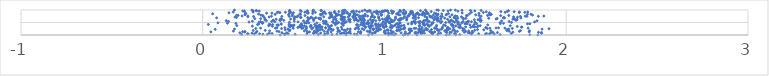
| Category | Series 0 |
|---|---|
| 1.8438936157573176 | 0.001 |
| 0.4256674932527743 | 0.002 |
| 0.911953011612636 | 0.003 |
| 1.1040859991475749 | 0.004 |
| 1.1787257875493318 | 0.005 |
| 1.3923923679515942 | 0.006 |
| 1.0236948340593237 | 0.007 |
| 1.0532423448962431 | 0.008 |
| 1.3403212470205785 | 0.009 |
| 1.7996658252891677 | 0.01 |
| 0.7888351358079853 | 0.011 |
| 1.4144852540602133 | 0.012 |
| 0.6363939020115403 | 0.013 |
| 1.636160623481195 | 0.014 |
| 0.7115385103624983 | 0.015 |
| 1.29357375120017 | 0.016 |
| 0.6688153314050215 | 0.017 |
| 1.1279973445585871 | 0.018 |
| 1.3572918561338354 | 0.019 |
| 0.2139469885280445 | 0.02 |
| 1.1125068891171774 | 0.021 |
| 0.45189188616307663 | 0.022 |
| 1.0411081092925865 | 0.023 |
| 0.35573032619404055 | 0.024 |
| 0.8483142597957474 | 0.025 |
| 0.4536478594561735 | 0.026 |
| 0.5083574089334616 | 0.027 |
| 0.9321189286647785 | 0.028 |
| 0.44825997662852113 | 0.029 |
| 0.33089283143013015 | 0.03 |
| 1.0221776447313897 | 0.031 |
| 0.738070737628259 | 0.032 |
| 0.8350222285193072 | 0.033 |
| 0.6751564485707275 | 0.034 |
| 1.0616765938343762 | 0.035 |
| 1.604240177692315 | 0.036 |
| 1.3906142667906276 | 0.037 |
| 0.28324913932921847 | 0.038 |
| 1.2647623054434503 | 0.039 |
| 1.4785122549884546 | 0.04 |
| 1.5554090086629766 | 0.041 |
| 0.5732361862831811 | 0.042 |
| 1.1306129370312052 | 0.043 |
| 0.31240657247157844 | 0.044 |
| 0.4700724940160792 | 0.045 |
| 0.2490015343782206 | 0.046 |
| 1.5774566233568632 | 0.047 |
| 0.2464613705899228 | 0.048 |
| 1.5183182032205556 | 0.049 |
| 0.7573103530183313 | 0.05 |
| 1.1740553027290597 | 0.051 |
| 1.0313953276368422 | 0.052 |
| 1.0038176810134625 | 0.053 |
| 1.3841838351472768 | 0.054 |
| 1.296186496250182 | 0.055 |
| 1.2031463897731118 | 0.056 |
| 1.5621499680339026 | 0.057 |
| 0.3815948136512741 | 0.058 |
| 1.2598501945424658 | 0.059 |
| 1.697794890092295 | 0.06 |
| 0.8681366318265862 | 0.061 |
| 1.1165637669570967 | 0.062 |
| 0.6887016957797044 | 0.063 |
| 0.8127502190042836 | 0.064 |
| 1.0064588001927202 | 0.065 |
| 1.8639860948172151 | 0.066 |
| 1.2017933893559563 | 0.067 |
| 0.6108010574634385 | 0.068 |
| 0.766365274682388 | 0.069 |
| 0.9322309571076606 | 0.07 |
| 0.27053662646684606 | 0.071 |
| 0.7783524823849933 | 0.072 |
| 0.3664113870873231 | 0.073 |
| 1.2190310097819246 | 0.074 |
| 0.6096536719953802 | 0.075 |
| 1.205623275003235 | 0.076 |
| 1.2680627604756187 | 0.077 |
| 0.6485643922632165 | 0.078 |
| 1.3082651667316392 | 0.079 |
| 0.7920874272491486 | 0.08 |
| 1.0213435737338106 | 0.081 |
| 1.137938705498944 | 0.082 |
| 1.4681152156693509 | 0.083 |
| 1.167420271348707 | 0.084 |
| 1.0917251841846387 | 0.085 |
| 0.6137917534155762 | 0.086 |
| 0.949013735587834 | 0.087 |
| 0.46230406916504485 | 0.088 |
| 0.2041263350813739 | 0.089 |
| 0.7767610643308159 | 0.09 |
| 0.4358997055101054 | 0.091 |
| 1.5866170127746424 | 0.092 |
| 0.626035499819206 | 0.093 |
| 0.2926001172153504 | 0.094 |
| 1.4606468969985116 | 0.095 |
| 0.8689856413042562 | 0.096 |
| 1.174586720276704 | 0.097 |
| 1.621161861812211 | 0.098 |
| 1.1862443692257325 | 0.099 |
| 0.9449172250851346 | 0.1 |
| 1.3432230148856177 | 0.101 |
| 1.4858645810767457 | 0.102 |
| 0.803174993489331 | 0.103 |
| 1.86396315312351 | 0.104 |
| 1.1702030182914118 | 0.105 |
| 0.5766221478911072 | 0.106 |
| 1.5958582403281822 | 0.107 |
| 0.9185454972814922 | 0.108 |
| 1.846934764109804 | 0.109 |
| 1.3666032417364167 | 0.11 |
| 1.3606986207919682 | 0.111 |
| 1.4384921198862122 | 0.112 |
| 0.9475419694817183 | 0.113 |
| 1.2606993618648796 | 0.114 |
| 1.7061959794485366 | 0.115 |
| 0.9999316862356284 | 0.116 |
| 1.0490585760011868 | 0.117 |
| 1.0413125208933605 | 0.118 |
| 0.9984310859251226 | 0.119 |
| 1.198830128292915 | 0.12 |
| 1.1147519435306399 | 0.121 |
| 0.5873773427167098 | 0.122 |
| 0.23114906065461926 | 0.123 |
| 0.7055489421990553 | 0.124 |
| 0.8555580228724442 | 0.125 |
| 0.04446541524293324 | 0.126 |
| 1.7959498262071008 | 0.127 |
| 1.2078365941563964 | 0.128 |
| 1.2762394466630962 | 0.129 |
| 1.3906718540608296 | 0.13 |
| 0.2199163243882395 | 0.131 |
| 1.3381948067389957 | 0.132 |
| 0.6260531580755702 | 0.133 |
| 0.6849581147362018 | 0.134 |
| 0.41958606481139227 | 0.135 |
| 0.7434080853026366 | 0.136 |
| 0.23236903861065794 | 0.137 |
| 0.5753065194649413 | 0.138 |
| 1.251527363012631 | 0.139 |
| 0.8688567273334334 | 0.14 |
| 1.2491011761564705 | 0.141 |
| 0.2980801695267826 | 0.142 |
| 1.4824560835016014 | 0.143 |
| 0.6686044356517533 | 0.144 |
| 1.4468314293246607 | 0.145 |
| 1.4008297778378793 | 0.146 |
| 1.686213585113197 | 0.147 |
| 1.742007598806821 | 0.148 |
| 0.9050955737164522 | 0.149 |
| 0.810062563686438 | 0.15 |
| 0.7535882673260551 | 0.151 |
| 0.9168711413222719 | 0.152 |
| 1.1438211172428479 | 0.153 |
| 0.4083881945237138 | 0.154 |
| 0.16867576204871204 | 0.155 |
| 1.3394270143721796 | 0.156 |
| 0.6128391551034864 | 0.157 |
| 0.9214809420894206 | 0.158 |
| 1.1988880073948693 | 0.159 |
| 1.2142920352356588 | 0.16 |
| 1.4633511323475712 | 0.161 |
| 0.5586265429564043 | 0.162 |
| 0.9640770474882591 | 0.163 |
| 1.2971214881891546 | 0.164 |
| 1.0003769658469883 | 0.165 |
| 1.3310351901597879 | 0.166 |
| 0.3679111633943546 | 0.167 |
| 1.7975911982406163 | 0.168 |
| 1.1894469384094435 | 0.169 |
| 0.4774102173595627 | 0.17 |
| 1.1497489113401196 | 0.171 |
| 1.58443741240445 | 0.172 |
| 1.0824871334337907 | 0.173 |
| 1.7480795918490268 | 0.174 |
| 1.0675637739036663 | 0.175 |
| 0.6366573991886569 | 0.176 |
| 0.7872829323034213 | 0.177 |
| 0.2777289419146801 | 0.178 |
| 0.9565169456331258 | 0.179 |
| 1.0354591056628029 | 0.18 |
| 1.0699708854958656 | 0.181 |
| 1.6726999928867983 | 0.182 |
| 1.1390536636427955 | 0.183 |
| 1.4309757058203378 | 0.184 |
| 1.3760545886513549 | 0.185 |
| 0.3435223781688995 | 0.186 |
| 1.4963029737765048 | 0.187 |
| 1.0210384486488702 | 0.188 |
| 1.2199460481268045 | 0.189 |
| 1.1954230969568476 | 0.19 |
| 0.7786837028672214 | 0.191 |
| 1.012693050066475 | 0.192 |
| 0.6269859385657236 | 0.193 |
| 1.1993726333748413 | 0.194 |
| 0.7156533797932242 | 0.195 |
| 1.3013646504780763 | 0.196 |
| 1.1368466997717082 | 0.197 |
| 1.384176838879851 | 0.198 |
| 1.2340705613332132 | 0.199 |
| 1.6764478581195843 | 0.2 |
| 0.473016187909301 | 0.201 |
| 1.340830279107675 | 0.202 |
| 0.6918665948354881 | 0.203 |
| 0.7444184264327961 | 0.204 |
| 0.4803873357748114 | 0.205 |
| 0.4537591054304101 | 0.206 |
| 1.0171230380178953 | 0.207 |
| 1.5463287229676528 | 0.208 |
| 0.9688311140743342 | 0.209 |
| 0.8866927107089437 | 0.21 |
| 1.0768982646492637 | 0.211 |
| 0.71765244271831 | 0.212 |
| 1.3495526957132316 | 0.213 |
| 1.6735375776905816 | 0.214 |
| 1.5116018112976608 | 0.215 |
| 0.6578331415708868 | 0.216 |
| 0.6454871557968953 | 0.217 |
| 1.2583416921545605 | 0.218 |
| 1.1885470048342885 | 0.219 |
| 0.56782250220449 | 0.22 |
| 1.2922378036710007 | 0.221 |
| 1.2893345451089062 | 0.222 |
| 1.4383257093641162 | 0.223 |
| 0.979017534935888 | 0.224 |
| 0.9395419766570786 | 0.225 |
| 0.0684831346432786 | 0.226 |
| 0.9361607522863752 | 0.227 |
| 1.2368943595608126 | 0.228 |
| 1.3472487779833537 | 0.229 |
| 0.7059717086507681 | 0.23 |
| 1.0912357500363221 | 0.231 |
| 0.7663424533239908 | 0.232 |
| 1.3135256961723583 | 0.233 |
| 0.7963456902006653 | 0.234 |
| 0.8583548327120225 | 0.235 |
| 1.1349566399689344 | 0.236 |
| 1.8669331356030068 | 0.237 |
| 0.17429633613368634 | 0.238 |
| 1.6838224460191005 | 0.239 |
| 0.811323411179664 | 0.24 |
| 1.1399589950964528 | 0.241 |
| 1.146041111238866 | 0.242 |
| 0.4690266772962166 | 0.243 |
| 0.8384390672112365 | 0.244 |
| 0.5996202500641734 | 0.245 |
| 0.9407755280729507 | 0.246 |
| 0.6258047523575079 | 0.247 |
| 1.3596719679127136 | 0.248 |
| 1.1043247694679574 | 0.249 |
| 1.9048461928251634 | 0.25 |
| 0.9685296508885334 | 0.251 |
| 0.8770974512343509 | 0.252 |
| 1.2861463873901375 | 0.253 |
| 1.2061736281769058 | 0.254 |
| 1.1102313258538223 | 0.255 |
| 0.6969814517254913 | 0.256 |
| 0.43371912584277295 | 0.257 |
| 1.4308672159538773 | 0.258 |
| 1.1916231555511863 | 0.259 |
| 0.2914387325089558 | 0.26 |
| 1.5654523708151835 | 0.261 |
| 0.5456240551566739 | 0.262 |
| 1.1633410288745933 | 0.263 |
| 0.9214296381272381 | 0.264 |
| 1.7033860683006323 | 0.265 |
| 1.1726906093965477 | 0.266 |
| 0.7007787493045445 | 0.267 |
| 0.9550931696778792 | 0.268 |
| 0.49773672943908664 | 0.269 |
| 1.106402682364232 | 0.27 |
| 1.2272308673287715 | 0.271 |
| 1.5800679287876114 | 0.272 |
| 1.3175170505399265 | 0.273 |
| 1.2753645580707036 | 0.274 |
| 0.39973852403444565 | 0.275 |
| 1.7900784214832561 | 0.276 |
| 0.31831584397889734 | 0.277 |
| 1.6622457363645249 | 0.278 |
| 0.5711531360283408 | 0.279 |
| 1.346093661981631 | 0.28 |
| 1.6136140616384886 | 0.281 |
| 0.8441950233263052 | 0.282 |
| 0.6335092298702253 | 0.283 |
| 0.676740342502381 | 0.284 |
| 0.7416022872837628 | 0.285 |
| 0.5521346855937569 | 0.286 |
| 1.6275103550943442 | 0.287 |
| 0.6061945979702953 | 0.288 |
| 0.40806687666326547 | 0.289 |
| 0.6762849537355075 | 0.29 |
| 0.45198437439536654 | 0.291 |
| 1.3789506052535392 | 0.292 |
| 0.9196757900090289 | 0.293 |
| 0.8532945347432529 | 0.294 |
| 1.0403938866761215 | 0.295 |
| 0.5233743861832347 | 0.296 |
| 0.8946353962434099 | 0.297 |
| 1.414887031582405 | 0.298 |
| 0.9972509710719478 | 0.299 |
| 1.1108976263576682 | 0.3 |
| 1.5571187584965365 | 0.301 |
| 1.2067119481047452 | 0.302 |
| 0.6510258459432072 | 0.303 |
| 1.0689228576145307 | 0.304 |
| 1.0310353685493618 | 0.305 |
| 1.3480955344541659 | 0.306 |
| 1.0780209370744402 | 0.307 |
| 1.4747953566621654 | 0.308 |
| 0.6279453503439968 | 0.309 |
| 1.0844548925929445 | 0.31 |
| 0.9211051461851083 | 0.311 |
| 1.4178519609339215 | 0.312 |
| 0.7627705987624745 | 0.313 |
| 1.3193834534071125 | 0.314 |
| 1.755569736779277 | 0.315 |
| 1.7542456342419346 | 0.316 |
| 1.0427895325623453 | 0.317 |
| 1.4972166695415146 | 0.318 |
| 0.6497015862557737 | 0.319 |
| 0.9228735784415127 | 0.32 |
| 0.99258782856671 | 0.321 |
| 1.4080803456413358 | 0.322 |
| 1.4464373386984017 | 0.323 |
| 1.51060589402181 | 0.324 |
| 0.592696589035448 | 0.325 |
| 0.6563762479533972 | 0.326 |
| 0.9653658490210708 | 0.327 |
| 0.6387214192121617 | 0.328 |
| 0.5367614109296436 | 0.329 |
| 0.8949676084322169 | 0.33 |
| 0.6429146907626828 | 0.331 |
| 0.5694042668955496 | 0.332 |
| 0.9947804220424995 | 0.333 |
| 1.284534867766998 | 0.334 |
| 0.5305905790000994 | 0.335 |
| 0.4807856804607441 | 0.336 |
| 0.5397831365128031 | 0.337 |
| 1.0099532456371003 | 0.338 |
| 0.4963173713765606 | 0.339 |
| 0.4826918514183951 | 0.34 |
| 1.7303954261482464 | 0.341 |
| 1.4894105527317127 | 0.342 |
| 0.6202459409831026 | 0.343 |
| 1.4141763235138662 | 0.344 |
| 0.692439479075697 | 0.345 |
| 1.2458384634778905 | 0.346 |
| 1.485390666221123 | 0.347 |
| 0.7024927215593103 | 0.348 |
| 0.3829178033886468 | 0.349 |
| 0.9693686981952638 | 0.35 |
| 0.9133082867001172 | 0.351 |
| 0.8568125726330379 | 0.352 |
| 0.9282973384346955 | 0.353 |
| 1.2451689368067393 | 0.354 |
| 0.9766848414430689 | 0.355 |
| 0.27278445478048896 | 0.356 |
| 1.1933371423626733 | 0.357 |
| 0.4742577537285261 | 0.358 |
| 1.0446064385226979 | 0.359 |
| 1.006703763052917 | 0.36 |
| 1.3918126181027393 | 0.361 |
| 1.5154203945522156 | 0.362 |
| 1.084332869430337 | 0.363 |
| 0.5599199456021613 | 0.364 |
| 0.9337876963009762 | 0.365 |
| 0.9532955844355497 | 0.366 |
| 0.595690424274507 | 0.367 |
| 0.6284826759914433 | 0.368 |
| 1.691779974470899 | 0.369 |
| 0.3633377998808264 | 0.37 |
| 1.5267485992183096 | 0.371 |
| 1.094472461744382 | 0.372 |
| 0.6390281847329726 | 0.373 |
| 1.1914992744996695 | 0.374 |
| 0.1876554972291643 | 0.375 |
| 1.335136817684917 | 0.376 |
| 1.3787461693803968 | 0.377 |
| 0.9755715429380284 | 0.378 |
| 1.3709822508734246 | 0.379 |
| 0.7088596358560478 | 0.38 |
| 0.4908012987995115 | 0.381 |
| 0.5471572268996069 | 0.382 |
| 1.056305502075931 | 0.383 |
| 0.5942835103659467 | 0.384 |
| 0.8826764797309171 | 0.385 |
| 1.286601565665745 | 0.386 |
| 1.1067438660769224 | 0.387 |
| 0.8857658910388927 | 0.388 |
| 0.4116459104266237 | 0.389 |
| 0.7732318165184505 | 0.39 |
| 1.0360799709092667 | 0.391 |
| 1.219937907944692 | 0.392 |
| 1.2399809901136 | 0.393 |
| 0.9272335874635881 | 0.394 |
| 1.219990259441886 | 0.395 |
| 0.4161648831225093 | 0.396 |
| 0.9905177022239078 | 0.397 |
| 0.4816728351031089 | 0.398 |
| 0.6436402627105048 | 0.399 |
| 1.3254568558291657 | 0.4 |
| 1.2404078026193566 | 0.401 |
| 0.5024264227105206 | 0.402 |
| 0.4086224566138592 | 0.403 |
| 1.2572234492913095 | 0.404 |
| 1.5679645798209387 | 0.405 |
| 0.5380294992720611 | 0.406 |
| 1.4696726760759566 | 0.407 |
| 0.9674041721105692 | 0.408 |
| 0.8460668083395503 | 0.409 |
| 1.058923254950448 | 0.41 |
| 1.4154123767131959 | 0.411 |
| 0.7303718196380851 | 0.412 |
| 0.8692411275542975 | 0.413 |
| 0.8507037324674787 | 0.414 |
| 1.0733985350799538 | 0.415 |
| 0.37036631202058123 | 0.416 |
| 0.30165300650673943 | 0.417 |
| 0.38468188575314977 | 0.418 |
| 1.373377939426157 | 0.419 |
| 0.6865978645537002 | 0.42 |
| 1.4940173490751532 | 0.421 |
| 0.030630997735233367 | 0.422 |
| 0.6161300079347796 | 0.423 |
| 0.9529343405754602 | 0.424 |
| 0.36479641183523104 | 0.425 |
| 1.2122121926440697 | 0.426 |
| 0.9663278964886624 | 0.427 |
| 1.3677315582506364 | 0.428 |
| 0.4754337988384221 | 0.429 |
| 0.9524764433382376 | 0.43 |
| 1.404381543911247 | 0.431 |
| 0.9490668143765804 | 0.432 |
| 0.8887564488594536 | 0.433 |
| 1.0739781107100028 | 0.434 |
| 0.3079009260925093 | 0.435 |
| 0.43222843741330585 | 0.436 |
| 1.0740693453434031 | 0.437 |
| 1.0052707396175666 | 0.438 |
| 0.6766752931290062 | 0.439 |
| 0.984088285609268 | 0.44 |
| 1.2321965550488012 | 0.441 |
| 1.1490956345956975 | 0.442 |
| 0.4309578994803266 | 0.443 |
| 0.5434188196395576 | 0.444 |
| 1.1300947452224155 | 0.445 |
| 1.7867092732991958 | 0.446 |
| 0.9099214145374263 | 0.447 |
| 1.8000758410360194 | 0.448 |
| 1.4426764258392784 | 0.449 |
| 1.4535916710064043 | 0.45 |
| 1.5070511358586556 | 0.451 |
| 0.7680945838545143 | 0.452 |
| 0.9028649993578197 | 0.453 |
| 1.6375457026486588 | 0.454 |
| 0.8776894806368502 | 0.455 |
| 1.1938798191397955 | 0.456 |
| 1.214709248181903 | 0.457 |
| 0.7643982128198207 | 0.458 |
| 1.0698158688969923 | 0.459 |
| 1.403779886067504 | 0.46 |
| 1.004756539346329 | 0.461 |
| 1.1697534586815495 | 0.462 |
| 0.18240950197802164 | 0.463 |
| 0.3279251229961636 | 0.464 |
| 1.2645941923952764 | 0.465 |
| 0.912311755015514 | 0.466 |
| 1.6549802535460112 | 0.467 |
| 0.9137656209849143 | 0.468 |
| 0.7408129208952987 | 0.469 |
| 0.6656197535756342 | 0.47 |
| 0.9295650911999728 | 0.471 |
| 1.4537949065643083 | 0.472 |
| 0.7300082134272031 | 0.473 |
| 0.13567185351429412 | 0.474 |
| 1.0845327345981686 | 0.475 |
| 0.5718628160284915 | 0.476 |
| 0.9017894775193485 | 0.477 |
| 0.6737657432018033 | 0.478 |
| 1.0291941503644693 | 0.479 |
| 0.7802006914012373 | 0.48 |
| 1.2603693029405343 | 0.481 |
| 0.6281399511065148 | 0.482 |
| 0.5616770751337722 | 0.483 |
| 1.4252839413278098 | 0.484 |
| 0.7301692634236113 | 0.485 |
| 0.08384696369285338 | 0.486 |
| 1.086152912161459 | 0.487 |
| 0.5618095053195215 | 0.488 |
| 1.3096266950865139 | 0.489 |
| 0.5836748085130523 | 0.49 |
| 1.2153157047725176 | 0.491 |
| 1.6357902615763766 | 0.492 |
| 1.2127354369915149 | 0.493 |
| 0.719572220828003 | 0.494 |
| 0.3308131985539514 | 0.495 |
| 1.2672278819270026 | 0.496 |
| 1.337092382469578 | 0.497 |
| 0.883979923635105 | 0.498 |
| 1.4036050548286703 | 0.499 |
| 1.4492263152158285 | 0.5 |
| 0.3261719493100448 | 0.501 |
| 0.7477919741585917 | 0.502 |
| 1.6986419025503334 | 0.503 |
| 1.0230813925797673 | 0.504 |
| 0.9320422602698906 | 0.505 |
| 1.0317662016666667 | 0.506 |
| 1.3561181129245714 | 0.507 |
| 0.47700070255674853 | 0.508 |
| 0.8739250637583597 | 0.509 |
| 1.3861587556473731 | 0.51 |
| 1.1529320245622072 | 0.511 |
| 0.31016827066149455 | 0.512 |
| 0.9945305058837395 | 0.513 |
| 1.4974246024329 | 0.514 |
| 1.4063459059776906 | 0.515 |
| 1.1503654990832077 | 0.516 |
| 1.20958689415392 | 0.517 |
| 0.7817489606305439 | 0.518 |
| 0.25437482458439586 | 0.519 |
| 1.1869119103373043 | 0.52 |
| 0.9932381865614953 | 0.521 |
| 1.8255930055580025 | 0.522 |
| 1.1701209747543175 | 0.523 |
| 0.8106217365451776 | 0.524 |
| 0.5242666371510013 | 0.525 |
| 1.034056893046847 | 0.526 |
| 1.1602872824762738 | 0.527 |
| 0.7902188031913154 | 0.528 |
| 0.39704067265488097 | 0.529 |
| 0.7145738503469362 | 0.53 |
| 1.4782402639706556 | 0.531 |
| 0.31787712456774175 | 0.532 |
| 0.9334431463207219 | 0.533 |
| 0.6796247290326058 | 0.534 |
| 1.458802434778653 | 0.535 |
| 1.3151082745072389 | 0.536 |
| 1.045408668394224 | 0.537 |
| 1.2466085372076292 | 0.538 |
| 1.23943640939323 | 0.539 |
| 1.4323512340941151 | 0.54 |
| 0.37903694888537465 | 0.541 |
| 1.6857601690350603 | 0.542 |
| 1.1958762693502982 | 0.543 |
| 0.14190610062354214 | 0.544 |
| 1.52833787418483 | 0.545 |
| 1.3771217842732895 | 0.546 |
| 1.1643271305895928 | 0.547 |
| 1.012541019548753 | 0.548 |
| 1.462212559494446 | 0.549 |
| 0.7723771732765635 | 0.55 |
| 0.2733356666704013 | 0.551 |
| 1.355149653727755 | 0.552 |
| 0.573617655563261 | 0.553 |
| 0.674806968605774 | 0.554 |
| 0.50356516991707 | 0.555 |
| 1.3022403394782556 | 0.556 |
| 0.9294375125683715 | 0.557 |
| 0.6629007270800279 | 0.558 |
| 0.8874895087692432 | 0.559 |
| 0.9097128601231597 | 0.56 |
| 1.0104145352511502 | 0.561 |
| 0.8566620978012256 | 0.562 |
| 1.0364584769448109 | 0.563 |
| 1.6443854147208792 | 0.564 |
| 1.3617137350698538 | 0.565 |
| 1.291537022896084 | 0.566 |
| 0.5540946803771726 | 0.567 |
| 1.8390282185952973 | 0.568 |
| 0.952458856506331 | 0.569 |
| 0.7360381208463138 | 0.57 |
| 0.12891722346256906 | 0.571 |
| 1.0393701871696432 | 0.572 |
| 0.35037357112968615 | 0.573 |
| 0.6102954917407858 | 0.574 |
| 1.014520016379298 | 0.575 |
| 0.8891610915476866 | 0.576 |
| 1.3965660265629416 | 0.577 |
| 1.0810887505477886 | 0.578 |
| 1.217234117728836 | 0.579 |
| 0.8045943239903832 | 0.58 |
| 0.9342043893169097 | 0.581 |
| 0.4270958838274913 | 0.582 |
| 1.2270676240464997 | 0.583 |
| 0.44575128424595345 | 0.584 |
| 1.5325918326078707 | 0.585 |
| 0.3882996730398053 | 0.586 |
| 0.38814302099921394 | 0.587 |
| 1.0545108897961004 | 0.588 |
| 0.8485465537365118 | 0.589 |
| 1.7257397530316814 | 0.59 |
| 0.8721276631290449 | 0.591 |
| 0.8338086337401313 | 0.592 |
| 0.9734175692823284 | 0.593 |
| 0.9396715561426078 | 0.594 |
| 1.122035719960508 | 0.595 |
| 0.423932534053734 | 0.596 |
| 1.368152357054797 | 0.597 |
| 0.765266296104421 | 0.598 |
| 0.579379571239767 | 0.599 |
| 1.0350217046844072 | 0.6 |
| 1.7206270571288846 | 0.601 |
| 0.3420424961370515 | 0.602 |
| 1.2723043319492846 | 0.603 |
| 1.0376003304292356 | 0.604 |
| 1.5218293720938758 | 0.605 |
| 1.0757193383760213 | 0.606 |
| 0.8833104246373717 | 0.607 |
| 1.5145168283584185 | 0.608 |
| 1.4944542336184585 | 0.609 |
| 0.7801751184077425 | 0.61 |
| 0.805044541830554 | 0.611 |
| 1.085592917874256 | 0.612 |
| 1.010122006384723 | 0.613 |
| 1.0166562982651723 | 0.614 |
| 0.8088524071638188 | 0.615 |
| 0.8108972035579952 | 0.616 |
| 0.7199242120781242 | 0.617 |
| 0.8885993981229255 | 0.618 |
| 1.729776323051849 | 0.619 |
| 0.8433974468917153 | 0.62 |
| 0.9214805801261184 | 0.621 |
| 1.2869233878826933 | 0.622 |
| 1.2323289269780937 | 0.623 |
| 1.0027337199937834 | 0.624 |
| 1.08976811025324 | 0.625 |
| 0.647412272078871 | 0.626 |
| 0.8032149605483411 | 0.627 |
| 0.34409507640352455 | 0.628 |
| 1.3470168279555004 | 0.629 |
| 1.2348914721534423 | 0.63 |
| 1.7065290365907775 | 0.631 |
| 0.4040511197470811 | 0.632 |
| 1.1231280119484353 | 0.633 |
| 1.171004255111705 | 0.634 |
| 0.503895825333473 | 0.635 |
| 0.9890538512590838 | 0.636 |
| 0.48352713096707234 | 0.637 |
| 1.0933597148168095 | 0.638 |
| 0.42796538165867726 | 0.639 |
| 1.6138814356436808 | 0.64 |
| 1.2778305363939322 | 0.641 |
| 0.7599834610977767 | 0.642 |
| 1.310491391607843 | 0.643 |
| 0.8401326317702884 | 0.644 |
| 0.583223535284656 | 0.645 |
| 1.084678170114977 | 0.646 |
| 0.43391636043241466 | 0.647 |
| 0.8653620389210065 | 0.648 |
| 0.8679070755290684 | 0.649 |
| 0.6134514587419126 | 0.65 |
| 0.7319307217931527 | 0.651 |
| 1.294841813572615 | 0.652 |
| 0.31859711067226437 | 0.653 |
| 1.4357644568224233 | 0.654 |
| 0.2862784970561304 | 0.655 |
| 1.3923374210073471 | 0.656 |
| 1.012839571496239 | 0.657 |
| 0.6055597875502304 | 0.658 |
| 0.7674942859250186 | 0.659 |
| 1.620082590107025 | 0.66 |
| 0.6476147954443914 | 0.661 |
| 1.091312909562403 | 0.662 |
| 1.0605795850485809 | 0.663 |
| 1.5259766637193273 | 0.664 |
| 1.7138729162032833 | 0.665 |
| 1.4309535455957254 | 0.666 |
| 1.4479210727559997 | 0.667 |
| 1.5735666828847523 | 0.668 |
| 1.4030142500269835 | 0.669 |
| 0.6377250409177453 | 0.67 |
| 0.9692413273417355 | 0.671 |
| 0.8840497665320635 | 0.672 |
| 1.1576993900901713 | 0.673 |
| 0.7708176576228691 | 0.674 |
| 1.3308942375965893 | 0.675 |
| 1.104239767076137 | 0.676 |
| 0.6450738607989945 | 0.677 |
| 1.0273987338159554 | 0.678 |
| 1.7506057022706436 | 0.679 |
| 1.1214128249097106 | 0.68 |
| 1.6603571955652148 | 0.681 |
| 0.8435913302900683 | 0.682 |
| 1.6537617928682804 | 0.683 |
| 0.5914165722750304 | 0.684 |
| 1.022152997546244 | 0.685 |
| 0.07635779611361393 | 0.686 |
| 0.5049618048320856 | 0.687 |
| 0.6958226411897313 | 0.688 |
| 0.9675826752959382 | 0.689 |
| 1.2644394815970341 | 0.69 |
| 1.3864548651641346 | 0.691 |
| 1.1870436031730276 | 0.692 |
| 0.7761171180727579 | 0.693 |
| 0.6223521942996864 | 0.694 |
| 0.8278352850124708 | 0.695 |
| 1.0122819285176714 | 0.696 |
| 0.5773617822315964 | 0.697 |
| 0.7246449454606053 | 0.698 |
| 0.5412053985486687 | 0.699 |
| 0.338380732970734 | 0.7 |
| 1.382571728885645 | 0.701 |
| 1.292076405780596 | 0.702 |
| 0.9442381277177144 | 0.703 |
| 0.18631973544596625 | 0.704 |
| 1.6564068671648204 | 0.705 |
| 0.7821826052077397 | 0.706 |
| 1.2332551697267409 | 0.707 |
| 0.8790900811915474 | 0.708 |
| 0.537019208346678 | 0.709 |
| 0.7033734999671646 | 0.71 |
| 1.7319705182130138 | 0.711 |
| 0.7753832307175517 | 0.712 |
| 0.17741053132910678 | 0.713 |
| 0.5973231531460659 | 0.714 |
| 0.9451523854113046 | 0.715 |
| 1.0606586704209215 | 0.716 |
| 0.7135022849333607 | 0.717 |
| 1.1707555090029023 | 0.718 |
| 1.2520604447384773 | 0.719 |
| 0.3649900257326779 | 0.72 |
| 1.1616173145089954 | 0.721 |
| 0.8619757427362109 | 0.722 |
| 1.279445802149748 | 0.723 |
| 0.9269896439911658 | 0.724 |
| 1.7097494900794257 | 0.725 |
| 0.8010481007333846 | 0.726 |
| 1.4232998634948686 | 0.727 |
| 0.5193614603138506 | 0.728 |
| 0.6656431175619529 | 0.729 |
| 1.3596453967730904 | 0.73 |
| 0.968108449696137 | 0.731 |
| 0.5058323050526368 | 0.732 |
| 1.2570055734740833 | 0.733 |
| 0.7667659814405605 | 0.734 |
| 0.930008664484604 | 0.735 |
| 0.24824101000201648 | 0.736 |
| 0.8258509945438234 | 0.737 |
| 1.3090229439593886 | 0.738 |
| 0.7618281130879293 | 0.739 |
| 1.1110505629343836 | 0.74 |
| 1.222190810011065 | 0.741 |
| 0.2794767557294727 | 0.742 |
| 1.3176658148421567 | 0.743 |
| 0.4349830269821867 | 0.744 |
| 1.7479509286184958 | 0.745 |
| 0.4761327599097177 | 0.746 |
| 1.8463903168295612 | 0.747 |
| 1.1304920650238854 | 0.748 |
| 1.783944337262784 | 0.749 |
| 0.8320076026754658 | 0.75 |
| 1.399478170662794 | 0.751 |
| 0.3779391623681151 | 0.752 |
| 1.7740742041814173 | 0.753 |
| 1.5315651781407646 | 0.754 |
| 1.0223435174111613 | 0.755 |
| 0.7320169364523846 | 0.756 |
| 0.24824858331661648 | 0.757 |
| 1.8767447802173916 | 0.758 |
| 0.8934090138412017 | 0.759 |
| 0.21658996232504413 | 0.76 |
| 0.9071308803142034 | 0.761 |
| 0.7059658403069892 | 0.762 |
| 0.8854220099092028 | 0.763 |
| 0.8636096316311165 | 0.764 |
| 0.8775384068270686 | 0.765 |
| 1.3889234940614172 | 0.766 |
| 1.1292106792405256 | 0.767 |
| 1.2484269675432937 | 0.768 |
| 0.4921836331045416 | 0.769 |
| 0.33104576811779474 | 0.77 |
| 0.8365539421188045 | 0.771 |
| 1.0187695441052245 | 0.772 |
| 0.5247431987268864 | 0.773 |
| 0.8068383586957038 | 0.774 |
| 1.4505962438877846 | 0.775 |
| 1.6393045865003573 | 0.776 |
| 0.5626928030761497 | 0.777 |
| 1.1689122838998312 | 0.778 |
| 0.32899573095311296 | 0.779 |
| 1.6839242087997024 | 0.78 |
| 1.5202603546640119 | 0.781 |
| 1.5670013986448226 | 0.782 |
| 1.4566369762095928 | 0.783 |
| 0.1945986268359401 | 0.784 |
| 0.7098691145931936 | 0.785 |
| 1.135351954309246 | 0.786 |
| 0.9339990336682104 | 0.787 |
| 0.9833958011023586 | 0.788 |
| 0.8377712664640659 | 0.789 |
| 0.18611070724214196 | 0.79 |
| 0.8382732779398047 | 0.791 |
| 0.7586989329832519 | 0.792 |
| 0.3199311892364345 | 0.793 |
| 0.7408353456556532 | 0.794 |
| 1.269150136381095 | 0.795 |
| 0.6513286334441812 | 0.796 |
| 1.2907881121194023 | 0.797 |
| 1.8144294597220778 | 0.798 |
| 1.1578865073319677 | 0.799 |
| 1.5806342617936515 | 0.8 |
| 1.0855451029221952 | 0.801 |
| 1.289132273023876 | 0.802 |
| 1.338730074694663 | 0.803 |
| 0.9813991998144433 | 0.804 |
| 1.208184009317798 | 0.805 |
| 0.8513263106279821 | 0.806 |
| 1.5018044600572504 | 0.807 |
| 1.3712557099142795 | 0.808 |
| 0.47204583656256516 | 0.809 |
| 1.2199968910851617 | 0.81 |
| 1.0790313907380966 | 0.811 |
| 0.7473279470837569 | 0.812 |
| 0.2327997992971491 | 0.813 |
| 0.8418564735169822 | 0.814 |
| 1.193703119649563 | 0.815 |
| 1.1877664091800724 | 0.816 |
| 0.7020601296344682 | 0.817 |
| 0.8077298916178215 | 0.818 |
| 0.5378009358183011 | 0.819 |
| 0.982528364216833 | 0.82 |
| 0.7377957541345025 | 0.821 |
| 1.3417472825454229 | 0.822 |
| 0.3984204078204847 | 0.823 |
| 0.646880976917903 | 0.824 |
| 0.7057069558471069 | 0.825 |
| 1.0756374298890483 | 0.826 |
| 0.4939344184872656 | 0.827 |
| 1.5879010409989436 | 0.828 |
| 0.8941205448264999 | 0.829 |
| 0.9817948022211487 | 0.83 |
| 1.2077635047269872 | 0.831 |
| 1.7865378623861163 | 0.832 |
| 1.8062271315259708 | 0.833 |
| 1.2949421000749393 | 0.834 |
| 1.1367400100001332 | 0.835 |
| 1.105817505222984 | 0.836 |
| 0.962245029269727 | 0.837 |
| 0.7683446688817084 | 0.838 |
| 0.8107079805150221 | 0.839 |
| 1.173735843187648 | 0.84 |
| 0.8316622252899082 | 0.841 |
| 0.6584546949977069 | 0.842 |
| 0.3072320128367828 | 0.843 |
| 1.3151337889226746 | 0.844 |
| 1.066486277618651 | 0.845 |
| 1.0734306383512067 | 0.846 |
| 0.05465352226304809 | 0.847 |
| 1.46794625535196 | 0.848 |
| 0.5350298528196041 | 0.849 |
| 1.5766574142281473 | 0.85 |
| 0.8330051343471184 | 0.851 |
| 0.7330852615730752 | 0.852 |
| 1.2210483611844625 | 0.853 |
| 0.23683232899090056 | 0.854 |
| 1.2832650664818033 | 0.855 |
| 0.6761931722227601 | 0.856 |
| 1.3518030470434228 | 0.857 |
| 1.229361598974501 | 0.858 |
| 1.1426909893676338 | 0.859 |
| 0.6046115805471423 | 0.86 |
| 1.2406345819122584 | 0.861 |
| 1.115399541187277 | 0.862 |
| 0.9304174457315603 | 0.863 |
| 1.236346363715351 | 0.864 |
| 0.835221518499742 | 0.865 |
| 1.5197716162374824 | 0.866 |
| 1.156402888156069 | 0.867 |
| 0.794881912613765 | 0.868 |
| 1.041765020617939 | 0.869 |
| 1.1817645693306775 | 0.87 |
| 0.47788236740907275 | 0.871 |
| 1.2746332959726892 | 0.872 |
| 0.3803113684020558 | 0.873 |
| 0.7785659280270842 | 0.874 |
| 0.35152231571544 | 0.875 |
| 0.5763461727531215 | 0.876 |
| 1.023644064373363 | 0.877 |
| 1.1485082346072215 | 0.878 |
| 1.1812661450302766 | 0.879 |
| 1.4274134969676737 | 0.88 |
| 0.58085835144428 | 0.881 |
| 0.7768280019838105 | 0.882 |
| 0.9552674528292052 | 0.883 |
| 1.0450704097742047 | 0.884 |
| 0.7061664497997815 | 0.885 |
| 1.100777739841775 | 0.886 |
| 0.1441511316664329 | 0.887 |
| 0.6975734628180394 | 0.888 |
| 1.1164463945448264 | 0.889 |
| 1.5769875224008527 | 0.89 |
| 0.5755139579470159 | 0.891 |
| 0.498996427370879 | 0.892 |
| 0.6692531170014664 | 0.893 |
| 0.7955818897544797 | 0.894 |
| 0.42469161434716474 | 0.895 |
| 1.076463684419426 | 0.896 |
| 0.23295167738149525 | 0.897 |
| 1.2119718486041462 | 0.898 |
| 0.4092379171292112 | 0.899 |
| 1.7416260775415822 | 0.9 |
| 1.543986853728747 | 0.901 |
| 0.7243328763783268 | 0.902 |
| 0.6624028068059384 | 0.903 |
| 0.7937790947501993 | 0.904 |
| 0.6197203637294182 | 0.905 |
| 0.48448211596497415 | 0.906 |
| 1.6638489842186999 | 0.907 |
| 1.772276943761379 | 0.908 |
| 0.45476844513513726 | 0.909 |
| 1.4782310897016429 | 0.91 |
| 1.1462060918464543 | 0.911 |
| 0.5617412592446258 | 0.912 |
| 1.2127384389670883 | 0.913 |
| 0.7691566131953125 | 0.914 |
| 0.4153006232232036 | 0.915 |
| 0.16748482029825085 | 0.916 |
| 0.8302063069434692 | 0.917 |
| 0.27702695500792673 | 0.918 |
| 1.1173440434182553 | 0.919 |
| 0.9734168665072722 | 0.92 |
| 1.043124018165761 | 0.921 |
| 1.7425366800775026 | 0.922 |
| 1.7881942960059058 | 0.923 |
| 0.8618665147813851 | 0.924 |
| 0.942627750441122 | 0.925 |
| 0.9583995698326877 | 0.926 |
| 0.9635149440292394 | 0.927 |
| 0.6688657231991547 | 0.928 |
| 0.8194616127770865 | 0.929 |
| 1.5599718398349278 | 0.93 |
| 1.7135572135847086 | 0.931 |
| 0.9874568612509794 | 0.932 |
| 0.9856210718080319 | 0.933 |
| 1.2311282659601868 | 0.934 |
| 1.0498671891935056 | 0.935 |
| 1.6404361609365676 | 0.936 |
| 0.748784558741594 | 0.937 |
| 1.256845507212713 | 0.938 |
| 1.1526741457043035 | 0.939 |
| 0.47651895638736774 | 0.94 |
| 1.1444893223205121 | 0.941 |
| 0.7253538255658953 | 0.942 |
| 0.9034427839156426 | 0.943 |
| 0.606849612554053 | 0.944 |
| 0.5751682386594417 | 0.945 |
| 1.6759871215485105 | 0.946 |
| 0.5415497564650757 | 0.947 |
| 0.9926384571932455 | 0.948 |
| 1.0884235397377562 | 0.949 |
| 0.8463997492519494 | 0.95 |
| 0.9203027190373304 | 0.951 |
| 1.0164102994425757 | 0.952 |
| 1.4039104959688262 | 0.953 |
| 0.9096448101785193 | 0.954 |
| 0.9873864929638905 | 0.955 |
| 0.31117806884576815 | 0.956 |
| 0.9563738462547049 | 0.957 |
| 0.27773868089402765 | 0.958 |
| 1.016128400813623 | 0.959 |
| 0.9217148204701705 | 0.96 |
| 0.22898504781251383 | 0.961 |
| 0.8288507259536845 | 0.962 |
| 1.3491442347766862 | 0.963 |
| 0.22028828847238136 | 0.964 |
| 0.8775054198839239 | 0.965 |
| 1.0381068431262022 | 0.966 |
| 1.49672595279472 | 0.967 |
| 0.9166668139335448 | 0.968 |
| 0.2970191177764153 | 0.969 |
| 0.9998020995121543 | 0.97 |
| 0.5753801824611756 | 0.971 |
| 1.682644389165398 | 0.972 |
| 1.007684825703427 | 0.973 |
| 0.7694461653538436 | 0.974 |
| 1.1978343163953276 | 0.975 |
| 0.7838946634128486 | 0.976 |
| 0.9169235214098658 | 0.977 |
| 0.6504485770383398 | 0.978 |
| 0.2937987141922076 | 0.979 |
| 1.3238440892925862 | 0.98 |
| 1.5316334907536788 | 0.981 |
| 0.5369565697131828 | 0.982 |
| 1.0849653074415548 | 0.983 |
| 0.6519244818309936 | 0.984 |
| 1.4726995710669155 | 0.985 |
| 0.47773716969678504 | 0.986 |
| 0.6078238890731734 | 0.987 |
| 1.10704688076097 | 0.988 |
| 1.4262175773837216 | 0.989 |
| 0.6085736670123879 | 0.99 |
| 1.2963545077558156 | 0.991 |
| 1.1059311941279362 | 0.992 |
| 0.7784640056633236 | 0.993 |
| 1.2254729058039469 | 0.994 |
| 1.3898415660401535 | 0.995 |
| 0.27068763112659633 | 0.996 |
| 0.1741498100638742 | 0.997 |
| 0.8914221979550228 | 0.998 |
| 1.3636055513409624 | 0.999 |
| 1.2883237230023024 | 1 |